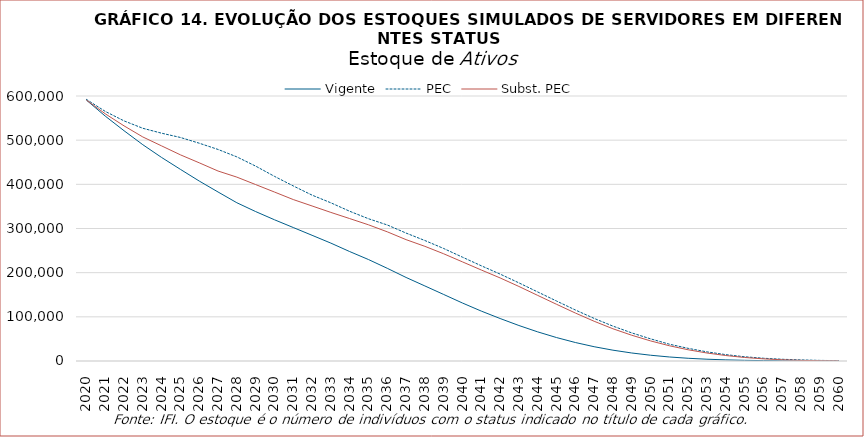
| Category | Vigente | PEC | Subst. PEC |
|---|---|---|---|
| 2020.0 | 590743 | 592360 | 590837 |
| 2021.0 | 554555 | 565209 | 559746 |
| 2022.0 | 521460 | 543683 | 532431 |
| 2023.0 | 489726 | 526913 | 507259 |
| 2024.0 | 460815 | 515754 | 487016 |
| 2025.0 | 433872 | 506103 | 466778 |
| 2026.0 | 407472 | 493091 | 448727 |
| 2027.0 | 382671 | 478982 | 430124 |
| 2028.0 | 358314 | 462172 | 416336 |
| 2029.0 | 338315 | 441274 | 399453 |
| 2030.0 | 319808 | 418094 | 382576 |
| 2031.0 | 302203 | 396402 | 365527 |
| 2032.0 | 284612 | 375554 | 351025 |
| 2033.0 | 266913 | 358160 | 336414 |
| 2034.0 | 247804 | 339048 | 322483 |
| 2035.0 | 229735 | 322144 | 308361 |
| 2036.0 | 209871 | 307970 | 292500 |
| 2037.0 | 189131 | 289642 | 274769 |
| 2038.0 | 169945 | 272765 | 259602 |
| 2039.0 | 150603 | 254715 | 242736 |
| 2040.0 | 131248 | 235044 | 224378 |
| 2041.0 | 112995 | 215573 | 206032 |
| 2042.0 | 96195 | 196780 | 188090 |
| 2043.0 | 80344 | 176920 | 168766 |
| 2044.0 | 65928 | 156322 | 148482 |
| 2045.0 | 53101 | 135816 | 128412 |
| 2046.0 | 41875 | 115529 | 108618 |
| 2047.0 | 32369 | 96447 | 89986 |
| 2048.0 | 24483 | 78993 | 72968 |
| 2049.0 | 18123 | 63629 | 58311 |
| 2050.0 | 13070 | 50152 | 45523 |
| 2051.0 | 9096 | 38033 | 34501 |
| 2052.0 | 6182 | 28664 | 25413 |
| 2053.0 | 4053 | 20647 | 18099 |
| 2054.0 | 2568 | 14398 | 12388 |
| 2055.0 | 1551 | 9580 | 7975 |
| 2056.0 | 882 | 6251 | 4857 |
| 2057.0 | 492 | 3920 | 2747 |
| 2058.0 | 262 | 2410 | 1387 |
| 2059.0 | 133 | 1375 | 628 |
| 2060.0 | 63 | 762 | 267 |